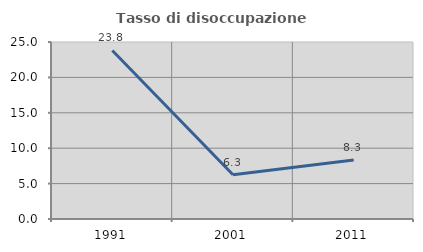
| Category | Tasso di disoccupazione giovanile  |
|---|---|
| 1991.0 | 23.81 |
| 2001.0 | 6.25 |
| 2011.0 | 8.333 |